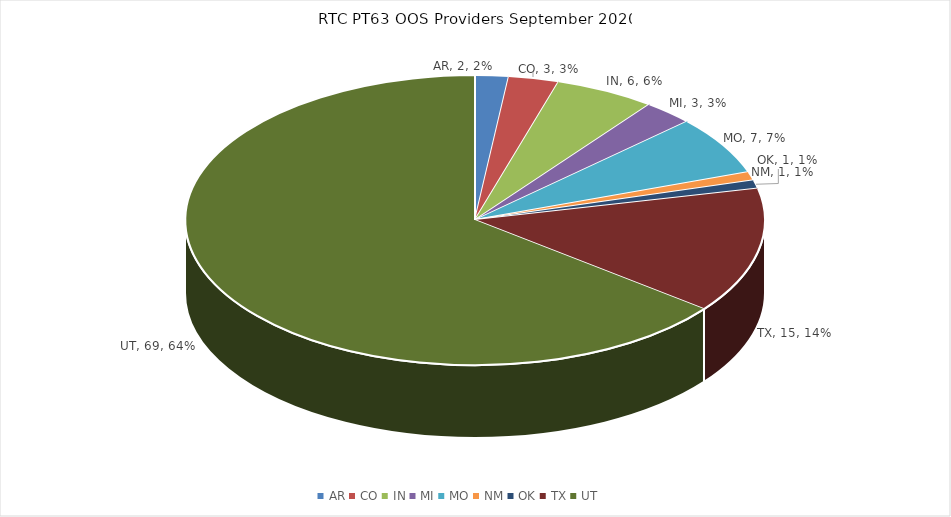
| Category | Series 0 |
|---|---|
| AR | 2 |
| CO | 3 |
| IN | 6 |
| MI | 3 |
| MO | 7 |
| NM | 1 |
| OK | 1 |
| TX | 15 |
| UT | 69 |